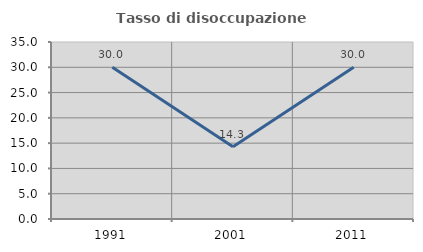
| Category | Tasso di disoccupazione giovanile  |
|---|---|
| 1991.0 | 30 |
| 2001.0 | 14.286 |
| 2011.0 | 30 |